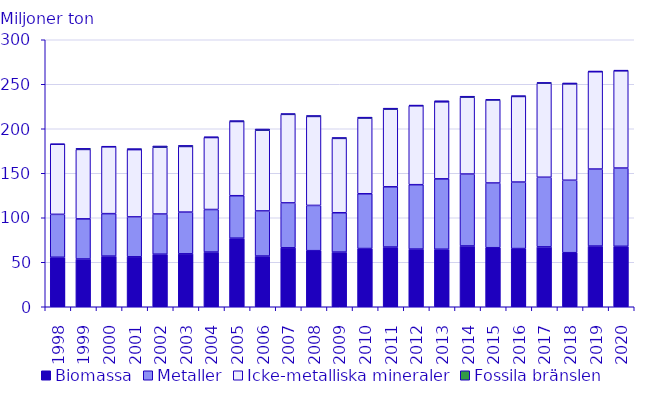
| Category | Biomassa | Metaller | Icke-metalliska mineraler | Fossila bränslen |
|---|---|---|---|---|
| 1998.0 | 55.605 | 48.234 | 78.756 | 0.319 |
| 1999.0 | 53.658 | 45.113 | 77.989 | 1.234 |
| 2000.0 | 56.896 | 47.732 | 75.055 | 0.712 |
| 2001.0 | 56.119 | 44.862 | 75.561 | 1.169 |
| 2002.0 | 59.06 | 45.156 | 75.047 | 1.406 |
| 2003.0 | 59.466 | 46.889 | 73.732 | 1.243 |
| 2004.0 | 61.446 | 47.83 | 80.845 | 0.894 |
| 2005.0 | 77.07 | 47.687 | 83.378 | 1 |
| 2006.0 | 56.982 | 50.691 | 90.646 | 1.427 |
| 2007.0 | 66.232 | 50.466 | 99.471 | 0.878 |
| 2008.0 | 63.017 | 50.844 | 99.977 | 1.071 |
| 2009.0 | 61.4 | 44.222 | 83.551 | 1.002 |
| 2010.0 | 65.423 | 61.516 | 85.067 | 1.039 |
| 2011.0 | 67.069 | 67.717 | 87.229 | 1.125 |
| 2012.0 | 64.789 | 72.374 | 88.61 | 0.847 |
| 2013.0 | 64.637 | 79.086 | 86.528 | 1.255 |
| 2014.0 | 68.304 | 80.836 | 86.326 | 1.112 |
| 2015.0 | 66.336 | 72.734 | 93.26 | 0.718 |
| 2016.0 | 65.388 | 74.733 | 96.14 | 0.925 |
| 2017.0 | 67.26 | 78.264 | 105.678 | 0.825 |
| 2018.0 | 60.729 | 81.424 | 108.271 | 1.04 |
| 2019.0 | 68.173 | 86.554 | 109.302 | 0.863 |
| 2020.0 | 67.909 | 87.949 | 109.225 | 0.787 |